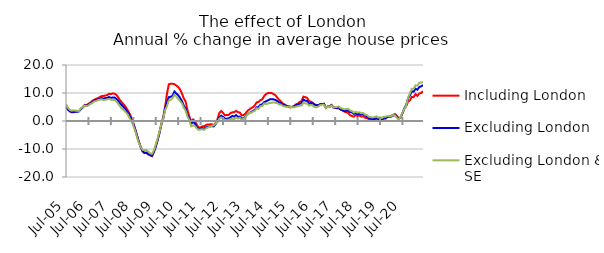
| Category | Including London | Excluding London | Excluding London & SE |
|---|---|---|---|
| 2005-07-01 | 5.042 | 5.34 | 6.041 |
| 2005-08-01 | 4.021 | 4.233 | 4.729 |
| 2005-09-01 | 3.44 | 3.609 | 4.031 |
| 2005-10-01 | 3.117 | 3.198 | 3.683 |
| 2005-11-01 | 3.119 | 3.179 | 3.804 |
| 2005-12-01 | 3.391 | 3.293 | 3.72 |
| 2006-01-01 | 3.46 | 3.314 | 3.632 |
| 2006-02-01 | 3.679 | 3.428 | 3.573 |
| 2006-03-01 | 4.36 | 4.288 | 4.578 |
| 2006-04-01 | 4.971 | 4.807 | 4.982 |
| 2006-05-01 | 5.703 | 5.549 | 5.472 |
| 2006-06-01 | 5.682 | 5.378 | 5.289 |
| 2006-07-01 | 6.13 | 5.818 | 5.553 |
| 2006-08-01 | 6.584 | 6.212 | 6.08 |
| 2006-09-01 | 7.141 | 6.725 | 6.422 |
| 2006-10-01 | 7.569 | 7.227 | 6.924 |
| 2006-11-01 | 7.9 | 7.477 | 7.14 |
| 2006-12-01 | 8.141 | 7.684 | 7.41 |
| 2007-01-01 | 8.527 | 7.906 | 7.62 |
| 2007-02-01 | 8.881 | 8.173 | 7.77 |
| 2007-03-01 | 8.911 | 8.019 | 7.457 |
| 2007-04-01 | 9.095 | 8.169 | 7.568 |
| 2007-05-01 | 9.213 | 8.204 | 7.716 |
| 2007-06-01 | 9.739 | 8.578 | 7.871 |
| 2007-07-01 | 9.603 | 8.264 | 7.598 |
| 2007-08-01 | 9.834 | 8.384 | 7.471 |
| 2007-09-01 | 9.759 | 8.353 | 7.476 |
| 2007-10-01 | 9.31 | 7.908 | 6.946 |
| 2007-11-01 | 8.338 | 7.116 | 6.089 |
| 2007-12-01 | 7.301 | 6.209 | 5.13 |
| 2008-01-01 | 6.594 | 5.569 | 4.358 |
| 2008-02-01 | 5.803 | 4.819 | 3.807 |
| 2008-03-01 | 4.897 | 4.031 | 3.135 |
| 2008-04-01 | 3.869 | 3.081 | 2.34 |
| 2008-05-01 | 2.669 | 1.982 | 1.042 |
| 2008-06-01 | 1.104 | 0.608 | -0.088 |
| 2008-07-01 | -0.68 | -0.992 | -1.674 |
| 2008-08-01 | -2.784 | -3 | -3.489 |
| 2008-09-01 | -5.142 | -5.294 | -5.824 |
| 2008-10-01 | -7.4 | -7.555 | -7.844 |
| 2008-11-01 | -9.283 | -9.376 | -9.246 |
| 2008-12-01 | -10.716 | -10.891 | -10.295 |
| 2009-01-01 | -11.416 | -11.431 | -10.399 |
| 2009-02-01 | -11.461 | -11.235 | -10.34 |
| 2009-03-01 | -11.986 | -11.748 | -10.864 |
| 2009-04-01 | -12.284 | -12.069 | -11.542 |
| 2009-05-01 | -12.391 | -12.497 | -11.751 |
| 2009-06-01 | -11.045 | -11.133 | -10.506 |
| 2009-07-01 | -9.035 | -9.204 | -8.454 |
| 2009-08-01 | -6.756 | -6.883 | -6.256 |
| 2009-09-01 | -3.959 | -4.358 | -3.813 |
| 2009-10-01 | -1.05 | -1.44 | -1.209 |
| 2009-11-01 | 1.332 | 0.762 | 0.706 |
| 2009-12-01 | 4.938 | 4.524 | 3.867 |
| 2010-01-01 | 9.666 | 6.473 | 5.237 |
| 2010-02-01 | 13.087 | 8.483 | 7.361 |
| 2010-03-01 | 13.284 | 8.635 | 7.462 |
| 2010-04-01 | 13.336 | 9.008 | 8.16 |
| 2010-05-01 | 13.12 | 10.528 | 9.387 |
| 2010-06-01 | 12.672 | 9.826 | 8.722 |
| 2010-07-01 | 12.136 | 9.253 | 7.893 |
| 2010-08-01 | 11.285 | 8.267 | 7.079 |
| 2010-09-01 | 9.83 | 7.192 | 6.308 |
| 2010-10-01 | 8.132 | 5.464 | 4.764 |
| 2010-11-01 | 6.944 | 4.376 | 3.643 |
| 2010-12-01 | 3.828 | 2.165 | 1.541 |
| 2011-01-01 | 1.555 | 0.94 | 0.308 |
| 2011-02-01 | -0.145 | -0.932 | -1.901 |
| 2011-03-01 | 0.576 | -0.311 | -1.539 |
| 2011-04-01 | -0.047 | -0.98 | -1.825 |
| 2011-05-01 | -1.375 | -2.157 | -2.653 |
| 2011-06-01 | -2.44 | -2.862 | -3.172 |
| 2011-07-01 | -2.248 | -2.732 | -3.038 |
| 2011-08-01 | -1.902 | -2.534 | -2.957 |
| 2011-09-01 | -1.894 | -2.72 | -3.136 |
| 2011-10-01 | -1.375 | -2.271 | -2.601 |
| 2011-11-01 | -1.232 | -2.041 | -2.302 |
| 2011-12-01 | -1.216 | -1.983 | -2.078 |
| 2012-01-01 | -1.135 | -1.817 | -1.736 |
| 2012-02-01 | -1.498 | -1.938 | -1.562 |
| 2012-03-01 | -0.754 | -1.159 | -0.865 |
| 2012-04-01 | 0.568 | -0.199 | -0.449 |
| 2012-05-01 | 2.809 | 1.391 | 0.799 |
| 2012-06-01 | 3.555 | 1.895 | 1.279 |
| 2012-07-01 | 2.96 | 1.471 | 0.853 |
| 2012-08-01 | 2.016 | 0.846 | 0.405 |
| 2012-09-01 | 2.155 | 0.788 | 0.262 |
| 2012-10-01 | 2.185 | 0.951 | 0.468 |
| 2012-11-01 | 2.83 | 1.343 | 0.606 |
| 2012-12-01 | 3.097 | 1.815 | 0.771 |
| 2013-01-01 | 3.135 | 1.584 | 0.626 |
| 2013-02-01 | 3.621 | 2.089 | 1.281 |
| 2013-03-01 | 3.142 | 1.441 | 0.855 |
| 2013-04-01 | 3.02 | 1.582 | 1.19 |
| 2013-05-01 | 1.989 | 0.799 | 0.359 |
| 2013-06-01 | 2.137 | 1.065 | 0.812 |
| 2013-07-01 | 2.63 | 1.589 | 1.441 |
| 2013-08-01 | 3.53 | 2.237 | 2.195 |
| 2013-09-01 | 4.078 | 2.856 | 2.882 |
| 2013-10-01 | 4.553 | 3.114 | 2.858 |
| 2013-11-01 | 4.94 | 3.551 | 3.342 |
| 2013-12-01 | 5.579 | 3.95 | 3.611 |
| 2014-01-01 | 6.635 | 4.909 | 4.55 |
| 2014-02-01 | 6.792 | 4.951 | 4.317 |
| 2014-03-01 | 7.439 | 5.778 | 5.291 |
| 2014-04-01 | 7.743 | 5.942 | 5.355 |
| 2014-05-01 | 8.904 | 6.758 | 6.25 |
| 2014-06-01 | 9.611 | 6.997 | 5.99 |
| 2014-07-01 | 9.945 | 7.369 | 6.241 |
| 2014-08-01 | 10.028 | 7.718 | 6.454 |
| 2014-09-01 | 9.975 | 7.779 | 6.477 |
| 2014-10-01 | 9.664 | 7.742 | 6.706 |
| 2014-11-01 | 9.231 | 7.538 | 6.472 |
| 2014-12-01 | 8.388 | 7.121 | 6.415 |
| 2015-01-01 | 7.539 | 6.66 | 5.914 |
| 2015-02-01 | 6.987 | 6.347 | 5.865 |
| 2015-03-01 | 6.235 | 5.859 | 5.371 |
| 2015-04-01 | 5.903 | 5.625 | 5.209 |
| 2015-05-01 | 5.319 | 5.414 | 5.019 |
| 2015-06-01 | 5.063 | 5.36 | 5.165 |
| 2015-07-01 | 4.841 | 5.099 | 5.035 |
| 2015-08-01 | 5.049 | 5.02 | 4.945 |
| 2015-09-01 | 5.228 | 5.181 | 4.854 |
| 2015-10-01 | 5.945 | 5.722 | 5.13 |
| 2015-11-01 | 6.153 | 5.836 | 5.253 |
| 2015-12-01 | 6.8 | 6.158 | 5.481 |
| 2016-01-01 | 7.002 | 6.247 | 5.577 |
| 2016-02-01 | 8.699 | 7.668 | 6.574 |
| 2016-03-01 | 8.503 | 7.286 | 6.288 |
| 2016-04-01 | 8.297 | 7.185 | 6.274 |
| 2016-05-01 | 7.068 | 6.166 | 5.521 |
| 2016-06-01 | 6.929 | 6.468 | 5.771 |
| 2016-07-01 | 6.559 | 6.28 | 5.487 |
| 2016-08-01 | 5.89 | 5.868 | 4.963 |
| 2016-09-01 | 5.707 | 5.601 | 4.885 |
| 2016-10-01 | 5.664 | 5.564 | 5.144 |
| 2016-11-01 | 6.074 | 5.931 | 5.679 |
| 2016-12-01 | 6.088 | 6.062 | 5.778 |
| 2017-01-01 | 6.111 | 6.173 | 5.796 |
| 2017-02-01 | 4.642 | 4.809 | 4.672 |
| 2017-03-01 | 5.09 | 5.198 | 5.12 |
| 2017-04-01 | 5.035 | 4.991 | 4.889 |
| 2017-05-01 | 5.716 | 5.642 | 5.503 |
| 2017-06-01 | 4.885 | 4.822 | 4.83 |
| 2017-07-01 | 4.672 | 4.724 | 4.935 |
| 2017-08-01 | 4.534 | 4.684 | 5.029 |
| 2017-09-01 | 4.581 | 4.691 | 5.187 |
| 2017-10-01 | 4.038 | 4.087 | 4.605 |
| 2017-11-01 | 3.791 | 3.804 | 4.428 |
| 2017-12-01 | 3.316 | 3.568 | 4.181 |
| 2018-01-01 | 3.101 | 3.644 | 4.305 |
| 2018-02-01 | 2.859 | 3.721 | 4.385 |
| 2018-03-01 | 2.042 | 3.184 | 3.756 |
| 2018-04-01 | 1.799 | 3.088 | 3.583 |
| 2018-05-01 | 1.526 | 2.518 | 2.976 |
| 2018-06-01 | 2.077 | 2.852 | 3.328 |
| 2018-07-01 | 1.803 | 2.439 | 2.991 |
| 2018-08-01 | 1.927 | 2.588 | 3.142 |
| 2018-09-01 | 1.565 | 2.31 | 2.754 |
| 2018-10-01 | 1.775 | 2.499 | 2.852 |
| 2018-11-01 | 1.139 | 1.997 | 2.267 |
| 2018-12-01 | 1.06 | 1.682 | 2.127 |
| 2019-01-01 | 0.665 | 1.094 | 1.545 |
| 2019-02-01 | 0.706 | 0.878 | 1.379 |
| 2019-03-01 | 0.67 | 0.735 | 1.277 |
| 2019-04-01 | 0.683 | 0.644 | 1.394 |
| 2019-05-01 | 0.984 | 0.937 | 1.68 |
| 2019-06-01 | 0.764 | 0.693 | 1.225 |
| 2019-07-01 | 0.911 | 0.933 | 1.357 |
| 2019-08-01 | 0.574 | 0.618 | 1.052 |
| 2019-09-01 | 0.867 | 0.962 | 1.554 |
| 2019-10-01 | 0.878 | 0.988 | 1.49 |
| 2019-11-01 | 1.508 | 1.487 | 1.829 |
| 2019-12-01 | 1.571 | 1.447 | 1.615 |
| 2020-01-01 | 1.857 | 1.552 | 1.729 |
| 2020-02-01 | 2.203 | 1.967 | 2.163 |
| 2020-03-01 | 2.497 | 2.153 | 1.967 |
| 2020-04-01 | 1.764 | 1.569 | 1.127 |
| 2020-05-01 | 0.912 | 0.858 | 0.519 |
| 2020-06-01 | 1.193 | 1.297 | 1.505 |
| 2020-07-01 | 2.752 | 2.8 | 2.993 |
| 2020-08-01 | 4.427 | 4.441 | 4.338 |
| 2020-09-01 | 5.27 | 5.712 | 5.451 |
| 2020-10-01 | 6.919 | 8.042 | 8.358 |
| 2020-11-01 | 7.394 | 9.158 | 9.882 |
| 2020-12-01 | 8.639 | 10.558 | 11.548 |
| 2021-01-01 | 8.506 | 10.451 | 11.512 |
| 2021-02-01 | 9.587 | 11.547 | 12.736 |
| 2021-03-01 | 8.939 | 11.155 | 12.669 |
| 2021-04-01 | 9.828 | 12.125 | 13.645 |
| 2021-05-01 | 10.011 | 12.358 | 13.741 |
| 2021-06-01 | 10.674 | 12.866 | 13.916 |